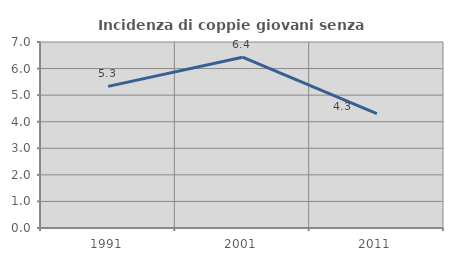
| Category | Incidenza di coppie giovani senza figli |
|---|---|
| 1991.0 | 5.329 |
| 2001.0 | 6.428 |
| 2011.0 | 4.304 |